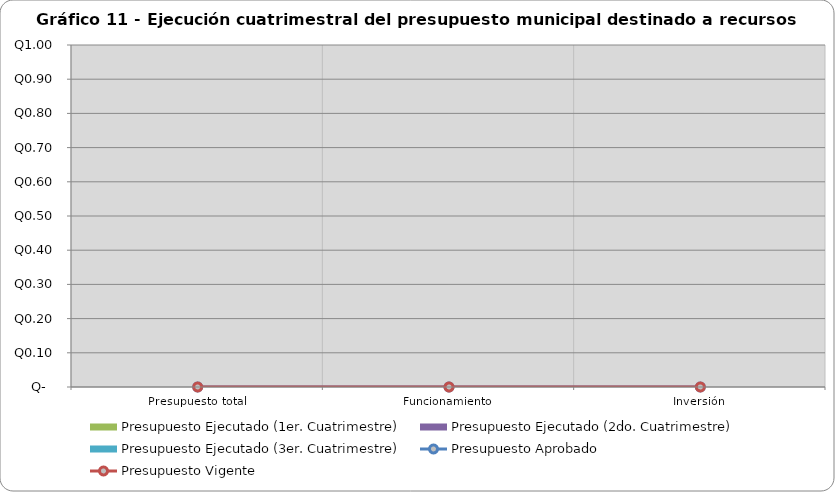
| Category | Presupuesto Ejecutado (1er. Cuatrimestre) | Presupuesto Ejecutado (2do. Cuatrimestre) | Presupuesto Ejecutado (3er. Cuatrimestre) |
|---|---|---|---|
| Presupuesto total | 0 | 0 | 0 |
| Funcionamiento | 0 | 0 | 0 |
| Inversión | 0 | 0 | 0 |